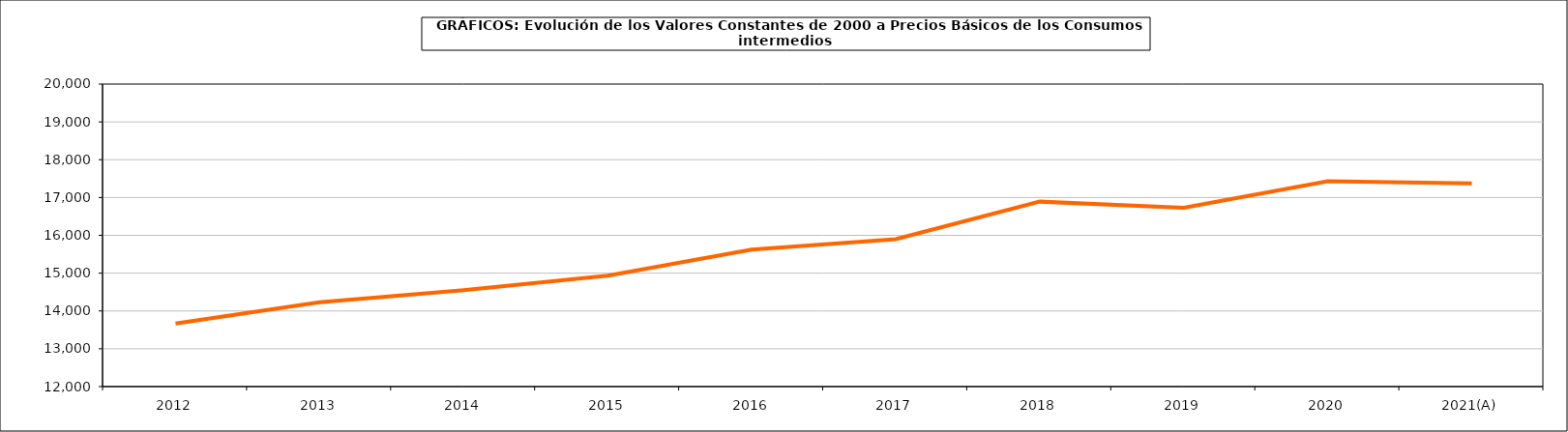
| Category | Total consumos intermedios |
|---|---|
| 2012 | 13669.3 |
| 2013 | 14227.7 |
| 2014 | 14550.6 |
| 2015 | 14933.8 |
| 2016 | 15620.2 |
| 2017 | 15898.5 |
| 2018 | 16891.1 |
| 2019 | 16730.8 |
| 2020 | 17428.5 |
| 2021(A) | 17375.5 |